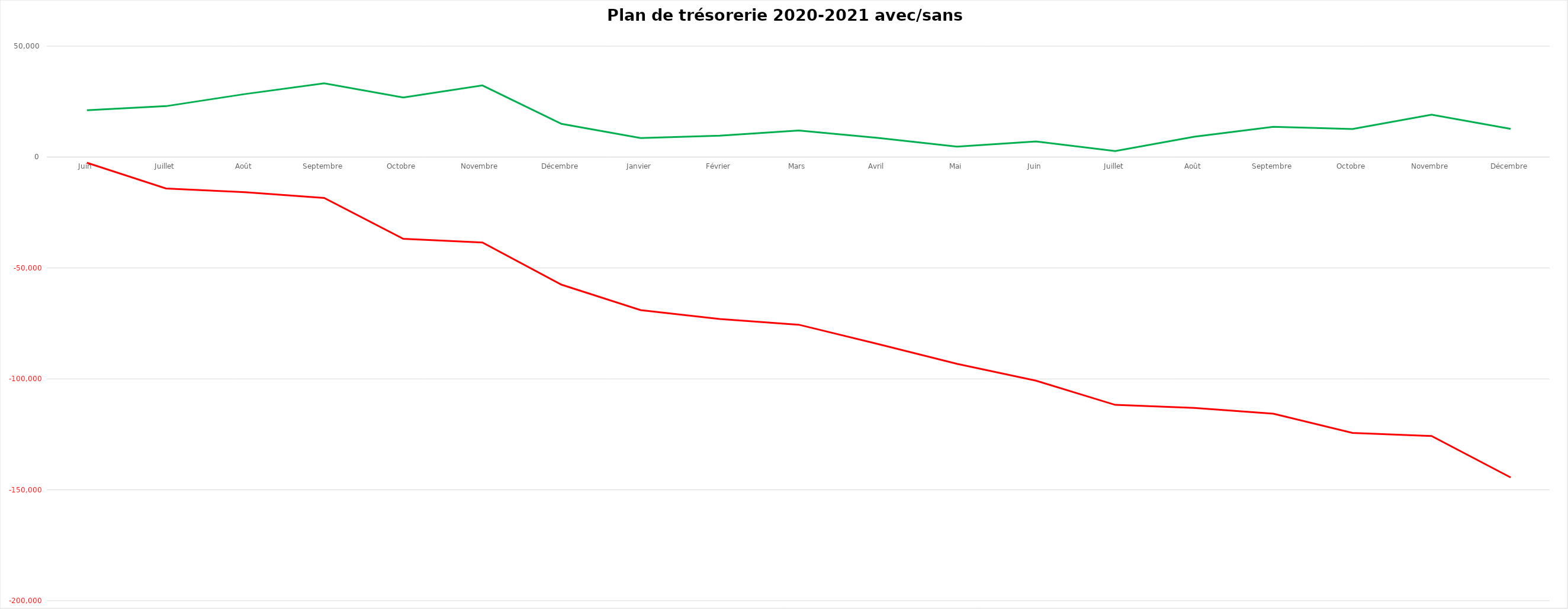
| Category | Solde de tréso fin de mois avant mesures | Solde de tréso fin de mois après mesures |
|---|---|---|
| Juin | -2549.27 | 21106.73 |
| Juillet | -14155.81 | 22954.19 |
| Août | -15845.62 | 28422.38 |
| Septembre | -18442.7 | 33281.3 |
| Octobre  | -36839.05 | 26840.95 |
| Novembre  | -38526.67 | 32311.33 |
| Décembre | -57521.56 | 14972.44 |
| Janvier | -68999.72 | 8554.28 |
| Février | -72977.15 | 9636.85 |
| Mars | -75569.85 | 11950.15 |
| Avril | -84253.82 | 8624.18 |
| Mai | -93229.06 | 4708.94 |
| Juin | -100819.57 | 7024.43 |
| Juillet | -111709.35 | 2690.65 |
| Août | -113098.4 | 9157.6 |
| Septembre | -115686.72 | 13675.28 |
| Octobre | -124366.31 | 12653.69 |
| Novembre | -125753.17 | 19122.83 |
| Décembre | -144447.3 | 12732.7 |